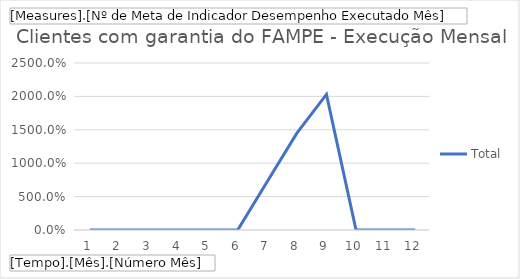
| Category | Total |
|---|---|
| 1 | 0 |
| 2 | 0 |
| 3 | 0 |
| 4 | 0 |
| 5 | 0 |
| 6 | 0 |
| 7 | 7.25 |
| 8 | 14.49 |
| 9 | 20.29 |
| 10 | 0 |
| 11 | 0 |
| 12 | 0 |